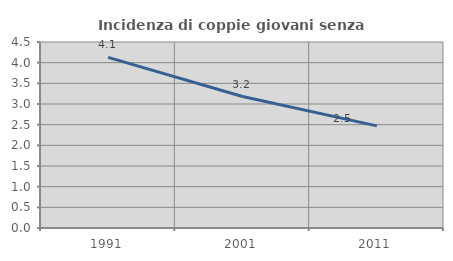
| Category | Incidenza di coppie giovani senza figli |
|---|---|
| 1991.0 | 4.127 |
| 2001.0 | 3.18 |
| 2011.0 | 2.471 |